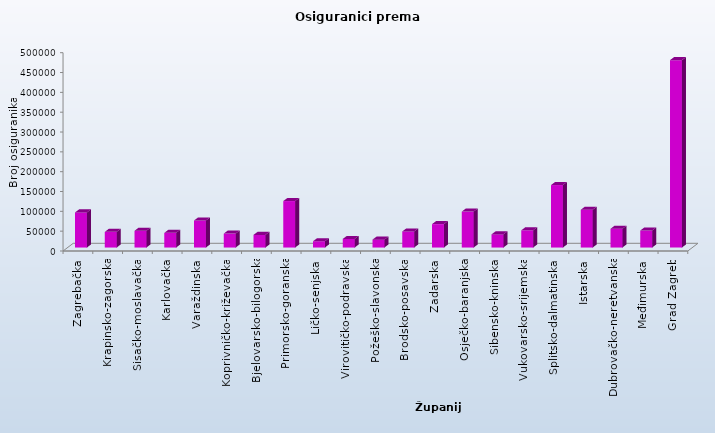
| Category | Series 0 |
|---|---|
| Zagrebačka | 88472 |
| Krapinsko-zagorska | 39541 |
| Sisačko-moslavačka | 42283 |
| Karlovačka | 37029 |
| Varaždinska | 68182 |
| Koprivničko-križevačka | 35176 |
| Bjelovarsko-bilogorska | 31854 |
| Primorsko-goranska | 117172 |
| Ličko-senjska | 15888 |
| Virovitičko-podravska | 21634 |
| Požeško-slavonska | 19886 |
| Brodsko-posavska | 40546 |
| Zadarska | 59045 |
| Osječko-baranjska | 90638 |
| Šibensko-kninska | 33112 |
| Vukovarsko-srijemska | 43476 |
| Splitsko-dalmatinska | 157561 |
| Istarska | 95261 |
| Dubrovačko-neretvanska | 47374 |
| Međimurska | 42888 |
| Grad Zagreb | 472492 |